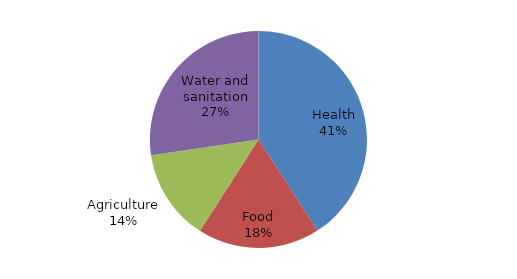
| Category | Series 0 |
|---|---|
| Health | 4496117 |
| Food | 2004812 |
| Agriculture | 1500000 |
| Water and sanitation | 3005372 |